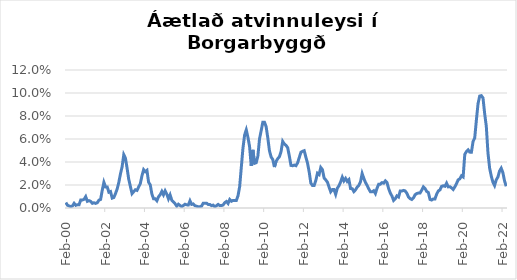
| Category | Series 0 |
|---|---|
| 2000-02-01 | 0.005 |
| 2000-03-01 | 0.002 |
| 2000-04-01 | 0.002 |
| 2000-05-01 | 0.001 |
| 2000-06-01 | 0.002 |
| 2000-07-01 | 0.004 |
| 2000-08-01 | 0.002 |
| 2000-09-01 | 0.003 |
| 2000-10-01 | 0.003 |
| 2000-11-01 | 0.007 |
| 2000-12-01 | 0.007 |
| 2001-01-01 | 0.008 |
| 2001-02-01 | 0.01 |
| 2001-03-01 | 0.006 |
| 2001-04-01 | 0.006 |
| 2001-05-01 | 0.006 |
| 2001-06-01 | 0.004 |
| 2001-07-01 | 0.005 |
| 2001-08-01 | 0.004 |
| 2001-09-01 | 0.005 |
| 2001-10-01 | 0.007 |
| 2001-11-01 | 0.007 |
| 2001-12-01 | 0.015 |
| 2002-01-01 | 0.022 |
| 2002-02-01 | 0.018 |
| 2002-03-01 | 0.018 |
| 2002-04-01 | 0.014 |
| 2002-05-01 | 0.014 |
| 2002-06-01 | 0.009 |
| 2002-07-01 | 0.009 |
| 2002-08-01 | 0.013 |
| 2002-09-01 | 0.017 |
| 2002-10-01 | 0.022 |
| 2002-11-01 | 0.03 |
| 2002-12-01 | 0.036 |
| 2003-01-01 | 0.046 |
| 2003-02-01 | 0.043 |
| 2003-03-01 | 0.035 |
| 2003-04-01 | 0.025 |
| 2003-05-01 | 0.019 |
| 2003-06-01 | 0.013 |
| 2003-07-01 | 0.014 |
| 2003-08-01 | 0.016 |
| 2003-09-01 | 0.015 |
| 2003-10-01 | 0.018 |
| 2003-11-01 | 0.021 |
| 2003-12-01 | 0.028 |
| 2004-01-01 | 0.033 |
| 2004-02-01 | 0.032 |
| 2004-03-01 | 0.033 |
| 2004-04-01 | 0.022 |
| 2004-05-01 | 0.02 |
| 2004-06-01 | 0.012 |
| 2004-07-01 | 0.008 |
| 2004-08-01 | 0.008 |
| 2004-09-01 | 0.006 |
| 2004-10-01 | 0.01 |
| 2004-11-01 | 0.012 |
| 2004-12-01 | 0.014 |
| 2005-01-01 | 0.012 |
| 2005-02-01 | 0.015 |
| 2005-03-01 | 0.012 |
| 2005-04-01 | 0.008 |
| 2005-05-01 | 0.011 |
| 2005-06-01 | 0.007 |
| 2005-07-01 | 0.005 |
| 2005-08-01 | 0.004 |
| 2005-09-01 | 0.002 |
| 2005-10-01 | 0.003 |
| 2005-11-01 | 0.002 |
| 2005-12-01 | 0.001 |
| 2006-01-01 | 0.002 |
| 2006-02-01 | 0.003 |
| 2006-03-01 | 0.003 |
| 2006-04-01 | 0.003 |
| 2006-05-01 | 0.006 |
| 2006-06-01 | 0.003 |
| 2006-07-01 | 0.004 |
| 2006-08-01 | 0.002 |
| 2006-09-01 | 0.002 |
| 2006-10-01 | 0.001 |
| 2006-11-01 | 0.001 |
| 2006-12-01 | 0.002 |
| 2007-01-01 | 0.004 |
| 2007-02-01 | 0.004 |
| 2007-03-01 | 0.004 |
| 2007-04-01 | 0.003 |
| 2007-05-01 | 0.003 |
| 2007-06-01 | 0.002 |
| 2007-07-01 | 0.003 |
| 2007-08-01 | 0.001 |
| 2007-09-01 | 0.002 |
| 2007-10-01 | 0.003 |
| 2007-11-01 | 0.002 |
| 2007-12-01 | 0.002 |
| 2008-01-01 | 0.003 |
| 2008-02-01 | 0.005 |
| 2008-03-01 | 0.006 |
| 2008-04-01 | 0.004 |
| 2008-05-01 | 0.007 |
| 2008-06-01 | 0.006 |
| 2008-07-01 | 0.007 |
| 2008-08-01 | 0.007 |
| 2008-09-01 | 0.007 |
| 2008-10-01 | 0.011 |
| 2008-11-01 | 0.018 |
| 2008-12-01 | 0.035 |
| 2009-01-01 | 0.052 |
| 2009-02-01 | 0.064 |
| 2009-03-01 | 0.068 |
| 2009-04-01 | 0.062 |
| 2009-05-01 | 0.053 |
| 2009-06-01 | 0.037 |
| 2009-07-01 | 0.051 |
| 2009-08-01 | 0.039 |
| 2009-09-01 | 0.039 |
| 2009-10-01 | 0.045 |
| 2009-11-01 | 0.06 |
| 2009-12-01 | 0.067 |
| 2010-01-01 | 0.075 |
| 2010-02-01 | 0.075 |
| 2010-03-01 | 0.071 |
| 2010-04-01 | 0.061 |
| 2010-05-01 | 0.05 |
| 2010-06-01 | 0.044 |
| 2010-07-01 | 0.042 |
| 2010-08-01 | 0.036 |
| 2010-09-01 | 0.041 |
| 2010-10-01 | 0.043 |
| 2010-11-01 | 0.045 |
| 2010-12-01 | 0.049 |
| 2011-01-01 | 0.058 |
| 2011-02-01 | 0.056 |
| 2011-03-01 | 0.055 |
| 2011-04-01 | 0.052 |
| 2011-05-01 | 0.045 |
| 2011-06-01 | 0.037 |
| 2011-07-01 | 0.037 |
| 2011-08-01 | 0.037 |
| 2011-09-01 | 0.037 |
| 2011-10-01 | 0.039 |
| 2011-11-01 | 0.044 |
| 2011-12-01 | 0.048 |
| 2012-01-01 | 0.049 |
| 2012-02-01 | 0.05 |
| 2012-03-01 | 0.044 |
| 2012-04-01 | 0.039 |
| 2012-05-01 | 0.031 |
| 2012-06-01 | 0.022 |
| 2012-07-01 | 0.02 |
| 2012-08-01 | 0.02 |
| 2012-09-01 | 0.024 |
| 2012-10-01 | 0.03 |
| 2012-11-01 | 0.029 |
| 2012-12-01 | 0.035 |
| 2013-01-01 | 0.033 |
| 2013-02-01 | 0.026 |
| 2013-03-01 | 0.024 |
| 2013-04-01 | 0.022 |
| 2013-05-01 | 0.018 |
| 2013-06-01 | 0.014 |
| 2013-07-01 | 0.016 |
| 2013-08-01 | 0.016 |
| 2013-09-01 | 0.012 |
| 2013-10-01 | 0.017 |
| 2013-11-01 | 0.019 |
| 2013-12-01 | 0.023 |
| 2014-01-01 | 0.027 |
| 2014-02-01 | 0.024 |
| 2014-03-01 | 0.026 |
| 2014-04-01 | 0.023 |
| 2014-05-01 | 0.025 |
| 2014-06-01 | 0.017 |
| 2014-07-01 | 0.017 |
| 2014-08-01 | 0.014 |
| 2014-09-01 | 0.016 |
| 2014-10-01 | 0.018 |
| 2014-11-01 | 0.02 |
| 2014-12-01 | 0.023 |
| 2015-01-01 | 0.03 |
| 2015-02-01 | 0.026 |
| 2015-03-01 | 0.022 |
| 2015-04-01 | 0.02 |
| 2015-05-01 | 0.017 |
| 2015-06-01 | 0.014 |
| 2015-07-01 | 0.014 |
| 2015-08-01 | 0.015 |
| 2015-09-01 | 0.013 |
| 2015-10-01 | 0.017 |
| 2015-11-01 | 0.021 |
| 2015-12-01 | 0.021 |
| 2016-01-01 | 0.022 |
| 2016-02-01 | 0.022 |
| 2016-03-01 | 0.024 |
| 2016-04-01 | 0.022 |
| 2016-05-01 | 0.017 |
| 2016-06-01 | 0.013 |
| 2016-07-01 | 0.01 |
| 2016-08-01 | 0.007 |
| 2016-09-01 | 0.008 |
| 2016-10-01 | 0.011 |
| 2016-11-01 | 0.01 |
| 2016-12-01 | 0.015 |
| 2017-01-01 | 0.015 |
| 2017-02-01 | 0.015 |
| 2017-03-01 | 0.015 |
| 2017-04-01 | 0.013 |
| 2017-05-01 | 0.01 |
| 2017-06-01 | 0.008 |
| 2017-07-01 | 0.007 |
| 2017-08-01 | 0.009 |
| 2017-09-01 | 0.012 |
| 2017-10-01 | 0.013 |
| 2017-11-01 | 0.013 |
| 2017-12-01 | 0.013 |
| 2018-01-01 | 0.016 |
| 2018-02-01 | 0.018 |
| 2018-03-01 | 0.017 |
| 2018-04-01 | 0.014 |
| 2018-05-01 | 0.013 |
| 2018-06-01 | 0.007 |
| 2018-07-01 | 0.007 |
| 2018-08-01 | 0.008 |
| 2018-09-01 | 0.008 |
| 2018-10-01 | 0.012 |
| 2018-11-01 | 0.015 |
| 2018-12-01 | 0.016 |
| 2019-01-01 | 0.019 |
| 2019-02-01 | 0.019 |
| 2019-03-01 | 0.019 |
| 2019-04-01 | 0.022 |
| 2019-05-01 | 0.018 |
| 2019-06-01 | 0.019 |
| 2019-07-01 | 0.017 |
| 2019-08-01 | 0.016 |
| 2019-09-01 | 0.018 |
| 2019-10-01 | 0.021 |
| 2019-11-01 | 0.024 |
| 2019-12-01 | 0.025 |
| 2020-01-01 | 0.028 |
| 2020-02-01 | 0.027 |
| 2020-03-01 | 0.047 |
| 2020-04-01 | 0.049 |
| 2020-05-01 | 0.051 |
| 2020-06-01 | 0.049 |
| 2020-07-01 | 0.048 |
| 2020-08-01 | 0.058 |
| 2020-09-01 | 0.061 |
| 2020-10-01 | 0.076 |
| 2020-11-01 | 0.091 |
| 2020-12-01 | 0.097 |
| 2021-01-01 | 0.098 |
| 2021-02-01 | 0.096 |
| 2021-03-01 | 0.082 |
| 2021-04-01 | 0.071 |
| 2021-05-01 | 0.048 |
| 2021-06-01 | 0.035 |
| 2021-07-01 | 0.028 |
| 2021-08-01 | 0.022 |
| 2021-09-01 | 0.02 |
| 2021-10-01 | 0.024 |
| 2021-11-01 | 0.027 |
| 2021-12-01 | 0.032 |
| 2022-01-01 | 0.035 |
| 2022-02-01 | 0.031 |
| 2022-03-01 | 0.024 |
| 2022-04-01 | 0.019 |